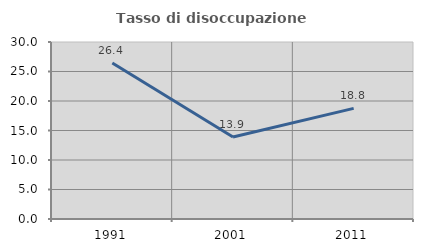
| Category | Tasso di disoccupazione giovanile  |
|---|---|
| 1991.0 | 26.437 |
| 2001.0 | 13.889 |
| 2011.0 | 18.75 |